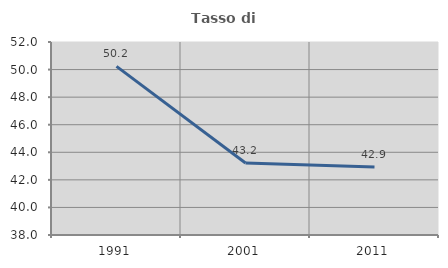
| Category | Tasso di occupazione   |
|---|---|
| 1991.0 | 50.231 |
| 2001.0 | 43.219 |
| 2011.0 | 42.941 |